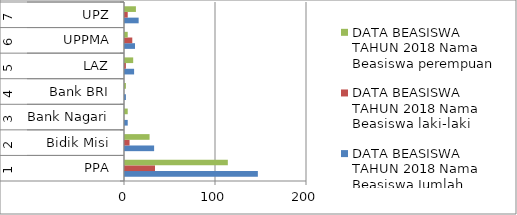
| Category | DATA BEASISWA TAHUN 2018 Nama Beasiswa Jumlah Beasiswa | DATA BEASISWA TAHUN 2018 Nama Beasiswa laki-laki | DATA BEASISWA TAHUN 2018 Nama Beasiswa perempuan |
|---|---|---|---|
| 0 | 146 | 33 | 113 |
| 1 | 32 | 5 | 27 |
| 2 | 3 | 0 | 3 |
| 3 | 1 | 0 | 1 |
| 4 | 10 | 1 | 9 |
| 5 | 11 | 8 | 3 |
| 6 | 15 | 3 | 12 |